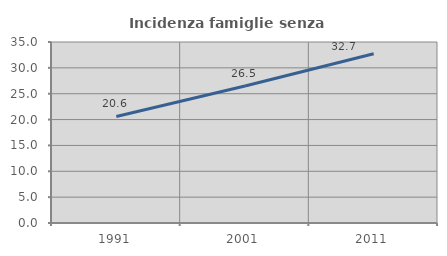
| Category | Incidenza famiglie senza nuclei |
|---|---|
| 1991.0 | 20.6 |
| 2001.0 | 26.495 |
| 2011.0 | 32.732 |